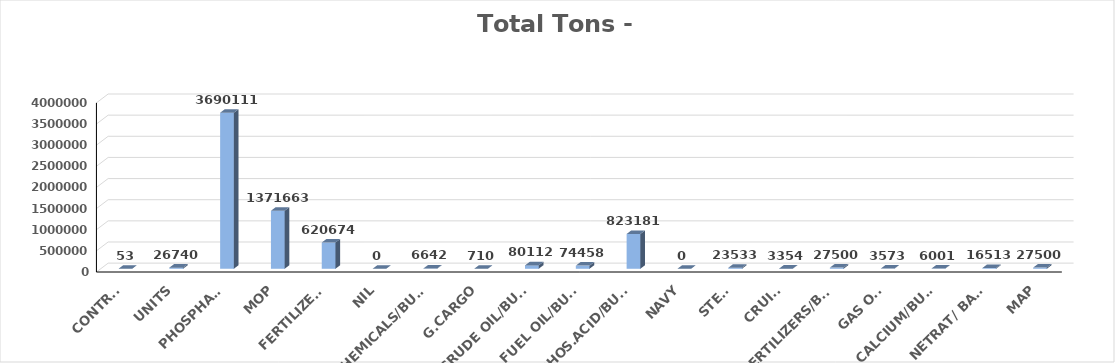
| Category | Series 0 |
|---|---|
| CONTRS. | 53 |
| UNITS | 26740 |
| PHOSPHATE | 3690111 |
| MOP | 1371663 |
| FERTILIZERS | 620674 |
| NIL | 0 |
| CHEMICALS/BULK | 6642 |
| G.CARGO | 710 |
| CRUDE OIL/BULK | 80112 |
| FUEL OIL/BULK | 74458 |
| PHOS.ACID/BULK | 823181 |
| NAVY | 0 |
| STEEL | 23533 |
| CRUISE | 3354 |
| FERTILIZERS/BAGS | 27500 |
| GAS OIL | 3573 |
| CALCIUM/BULK | 6001 |
| NETRAT/ BAGS | 16513 |
| MAP | 27500 |